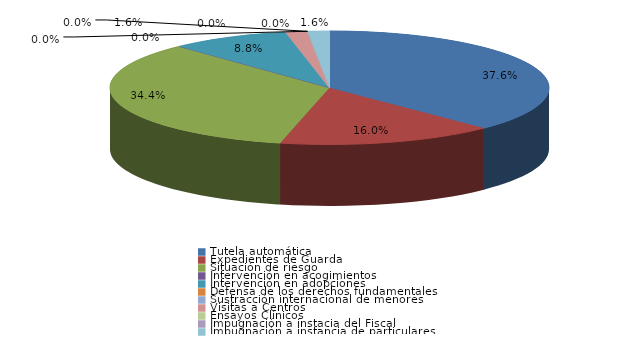
| Category | Series 0 |
|---|---|
| Tutela automática | 47 |
| Expedientes de Guarda | 20 |
| Situación de riesgo | 43 |
| Intervención en acogimientos | 0 |
| Intervención en adopciones | 11 |
| Defensa de los derechos fundamentales | 0 |
| Sustracción internacional de menores | 0 |
| Visitas a Centros | 2 |
| Ensayos Clínicos | 0 |
| Impugnación a instacia del Fiscal | 0 |
| Impugnación a instancia de particulares | 2 |